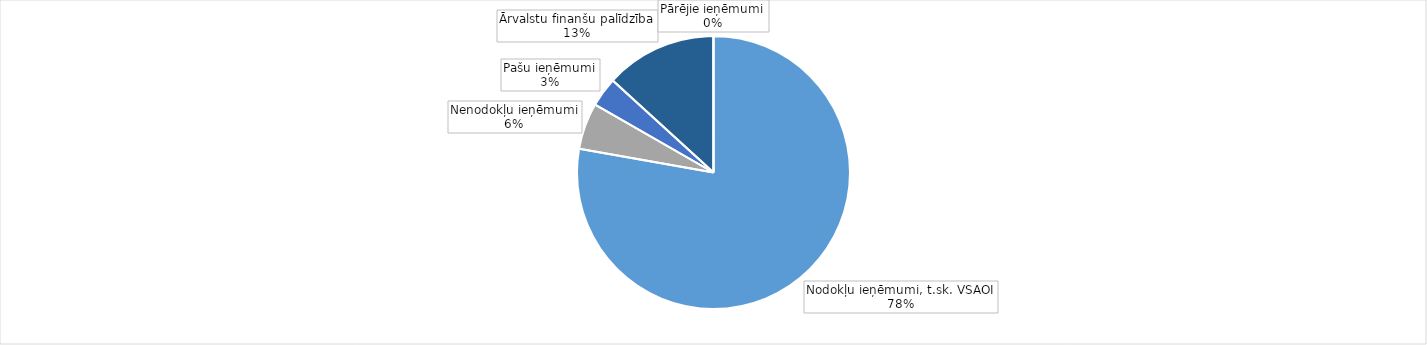
| Category | Series 0 |
|---|---|
| Nodokļu ieņēmumi, t.sk. VSAOI | 1101148.3 |
| Nenodokļu ieņēmumi | 77884.473 |
| Pašu ieņēmumi | 49427.971 |
| Ārvalstu finanšu palīdzība | 187049.612 |
| Pārējie ieņēmumi | 137.288 |